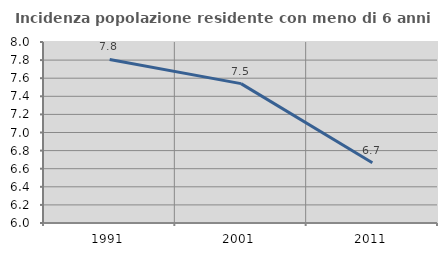
| Category | Incidenza popolazione residente con meno di 6 anni |
|---|---|
| 1991.0 | 7.807 |
| 2001.0 | 7.54 |
| 2011.0 | 6.667 |